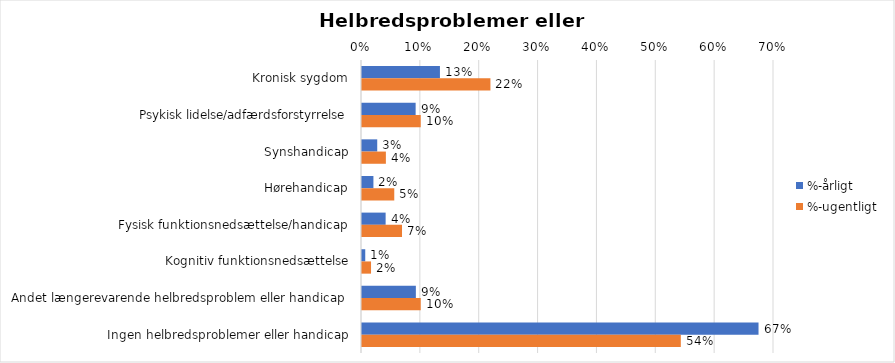
| Category | %-årligt | %-ugentligt |
|---|---|---|
| Kronisk sygdom | 0.132 | 0.218 |
| Psykisk lidelse/adfærdsforstyrrelse | 0.091 | 0.1 |
| Synshandicap | 0.026 | 0.041 |
| Hørehandicap | 0.019 | 0.055 |
| Fysisk funktionsnedsættelse/handicap | 0.04 | 0.068 |
| Kognitiv funktionsnedsættelse | 0.006 | 0.015 |
| Andet længerevarende helbredsproblem eller handicap  | 0.092 | 0.1 |
| Ingen helbredsproblemer eller handicap | 0.674 | 0.542 |